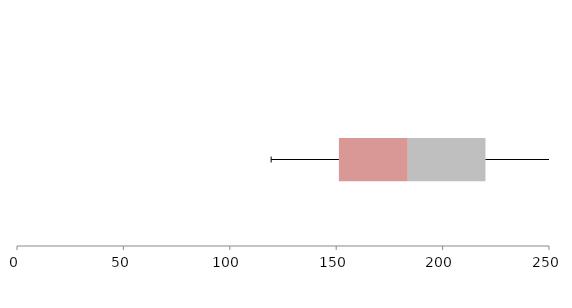
| Category | Series 1 | Series 2 | Series 3 |
|---|---|---|---|
| 0 | 151.278 | 32.368 | 36.499 |